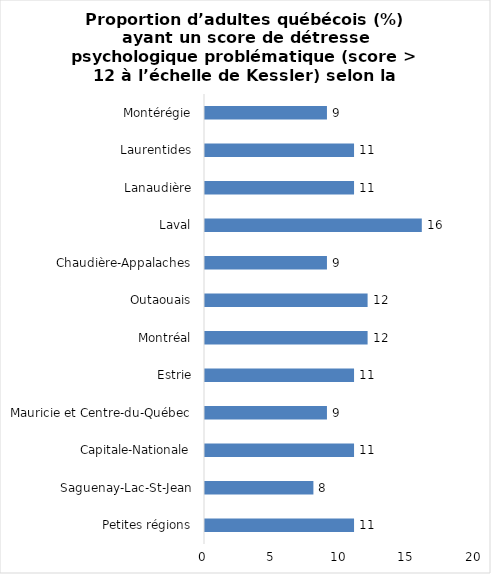
| Category | Series 0 |
|---|---|
| Petites régions | 11 |
| Saguenay-Lac-St-Jean | 8 |
| Capitale-Nationale | 11 |
| Mauricie et Centre-du-Québec | 9 |
| Estrie | 11 |
| Montréal | 12 |
| Outaouais | 12 |
| Chaudière-Appalaches | 9 |
| Laval | 16 |
| Lanaudière | 11 |
| Laurentides | 11 |
| Montérégie | 9 |